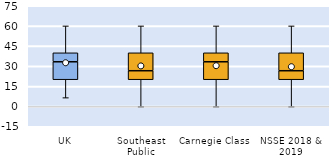
| Category | 25th | 50th | 75th |
|---|---|---|---|
| UK | 20 | 13.333 | 6.667 |
| Southeast Public | 20 | 6.667 | 13.333 |
| Carnegie Class | 20 | 13.333 | 6.667 |
| NSSE 2018 & 2019 | 20 | 6.667 | 13.333 |